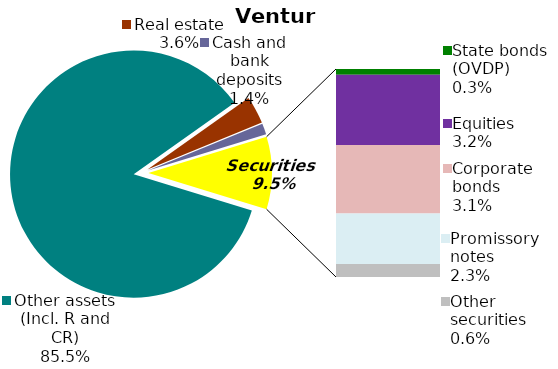
| Category | Series 0 |
|---|---|
| Other assets (Incl. R and CR) | 0.855 |
| Real estate | 0.036 |
| Cash and bank deposits | 0.014 |
| State bonds (OVDP) | 0.003 |
| Municipal bonds | 0 |
| Equities | 0.032 |
| Corporate bonds | 0.031 |
| Promissory notes | 0.023 |
| Other securities | 0.006 |